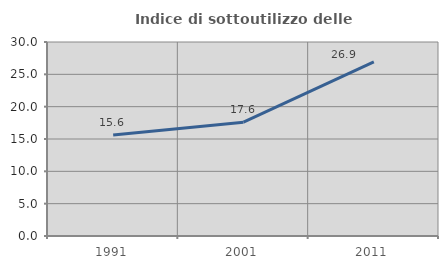
| Category | Indice di sottoutilizzo delle abitazioni  |
|---|---|
| 1991.0 | 15.61 |
| 2001.0 | 17.597 |
| 2011.0 | 26.939 |